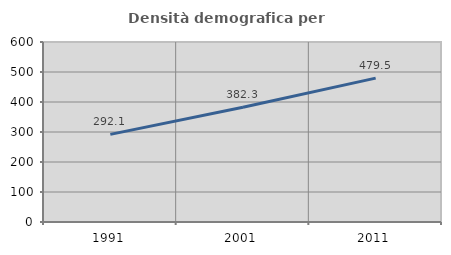
| Category | Densità demografica |
|---|---|
| 1991.0 | 292.065 |
| 2001.0 | 382.29 |
| 2011.0 | 479.55 |